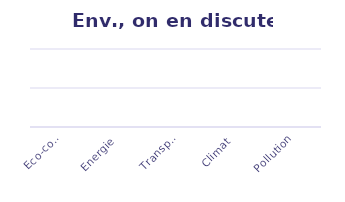
| Category | On en discute |
|---|---|
| Eco-conception | 0 |
| Energie | 0 |
| Transport | 0 |
| Climat | 0 |
| Pollution | 0 |